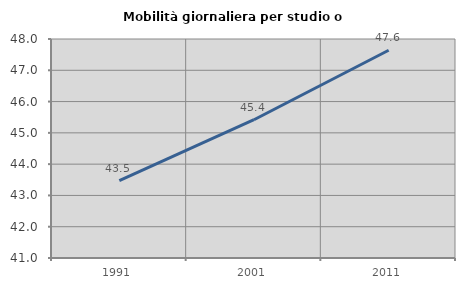
| Category | Mobilità giornaliera per studio o lavoro |
|---|---|
| 1991.0 | 43.473 |
| 2001.0 | 45.42 |
| 2011.0 | 47.639 |